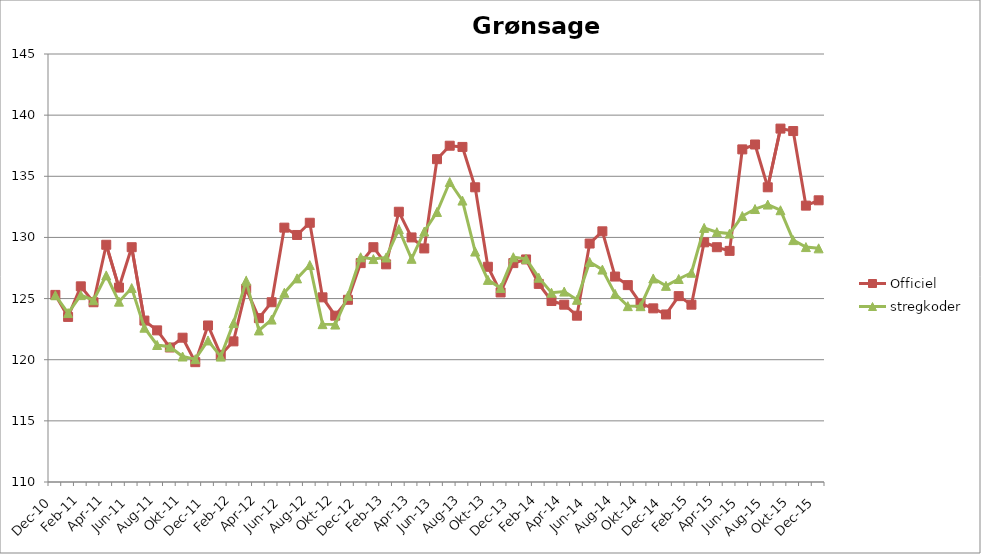
| Category | Officiel | stregkoder |
|---|---|---|
|  Dec-10 | 125.3 | 125.271 |
|  Jan-11 | 123.5 | 123.815 |
|  Feb-11 | 126 | 125.281 |
|  Mar-11 | 124.7 | 124.863 |
|  Apr-11 | 129.4 | 126.896 |
|  Maj-11 | 125.9 | 124.747 |
|  Jun-11 | 129.2 | 125.86 |
|  Jul-11 | 123.2 | 122.618 |
|  Aug-11 | 122.4 | 121.204 |
|  Sep-11 | 121 | 121.06 |
|  Okt-11 | 121.8 | 120.262 |
|  Nov-11 | 119.8 | 120.043 |
|  Dec-11 | 122.8 | 121.575 |
|  Jan-12 | 120.4 | 120.255 |
|  Feb-12 | 121.5 | 122.99 |
|  Mar-12 | 125.8 | 126.458 |
|  Apr-12 | 123.4 | 122.393 |
|  Maj-12 | 124.7 | 123.283 |
|  Jun-12 | 130.8 | 125.476 |
|  Jul-12 | 130.2 | 126.651 |
|  Aug-12 | 131.2 | 127.742 |
|  Sep-12 | 125.1 | 122.908 |
|  Okt-12 | 123.6 | 122.875 |
|  Nov-12 | 124.9 | 125.226 |
|  Dec-12 | 127.9 | 128.377 |
|  Jan-13 | 129.2 | 128.23 |
|  Feb-13 | 127.8 | 128.361 |
|  Mar-13 | 132.1 | 130.678 |
|  Apr-13 | 130 | 128.251 |
|  Maj-13 | 129.1 | 130.482 |
|  Jun-13 | 136.4 | 132.082 |
|  Jul-13 | 137.5 | 134.533 |
|  Aug-13 | 137.4 | 133.014 |
|  Sep-13 | 134.1 | 128.845 |
|  Okt-13 | 127.6 | 126.528 |
|  Nov-13 | 125.5 | 125.871 |
|  Dec-13 | 127.9 | 128.379 |
|  Jan-14 | 128.2 | 128.246 |
|  Feb-14 | 126.2 | 126.707 |
|  Mar-14 | 124.8 | 125.477 |
|  Apr-14 | 124.5 | 125.571 |
|  Maj-14 | 123.6 | 124.899 |
|  Jun-14 | 129.5 | 127.99 |
|  Jul-14 | 130.5 | 127.369 |
|  Aug-14 | 126.8 | 125.379 |
|  Sep-14 | 126.1 | 124.382 |
|  Okt-14 | 124.6 | 124.377 |
|  Nov-14 | 124.2 | 126.645 |
|  Dec-14 | 123.7 | 126.039 |
|  Jan-15 | 125.2 | 126.601 |
|  Feb-15 | 124.5 | 127.11 |
|  Mar-15 | 129.6 | 130.781 |
|  Apr-15 | 129.2 | 130.429 |
|  Maj-15 | 128.9 | 130.315 |
| Jun-15 | 137.2 | 131.75 |
| Jul-15 | 137.6 | 132.322 |
| Aug-15 | 134.1 | 132.688 |
| Sep-15 | 138.9 | 132.224 |
| Okt-15 | 138.7 | 129.781 |
| Nov-15 | 132.6 | 129.212 |
| Dec-15 | 133.035 | 129.107 |